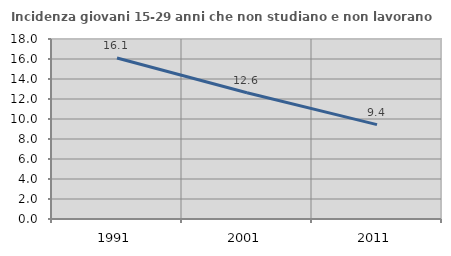
| Category | Incidenza giovani 15-29 anni che non studiano e non lavorano  |
|---|---|
| 1991.0 | 16.107 |
| 2001.0 | 12.632 |
| 2011.0 | 9.434 |